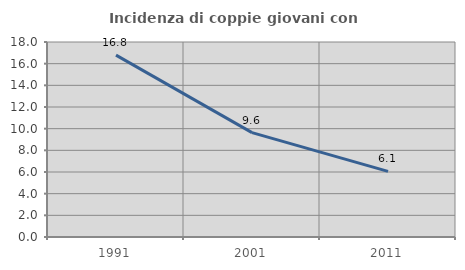
| Category | Incidenza di coppie giovani con figli |
|---|---|
| 1991.0 | 16.793 |
| 2001.0 | 9.637 |
| 2011.0 | 6.055 |